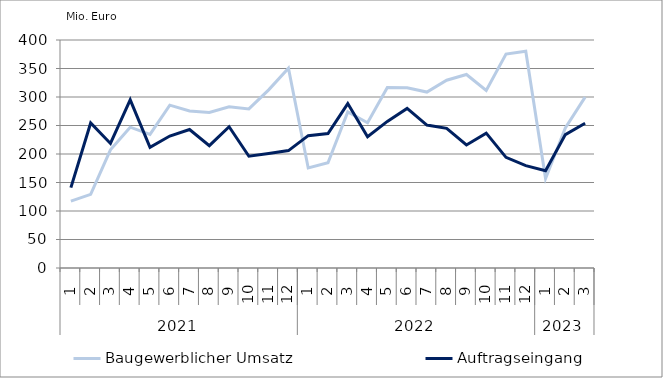
| Category | Baugewerblicher Umsatz | Auftragseingang |
|---|---|---|
| 0 | 117421.805 | 141020.655 |
| 1 | 129162.55 | 254416.876 |
| 2 | 207280.837 | 218451.405 |
| 3 | 247094.279 | 295077.868 |
| 4 | 234515.312 | 211696.129 |
| 5 | 285732.845 | 231455.155 |
| 6 | 275480.885 | 242932.505 |
| 7 | 272787.524 | 214636.944 |
| 8 | 282850.254 | 247827.991 |
| 9 | 279173.21 | 196069.238 |
| 10 | 312511.437 | 201015.897 |
| 11 | 350582.01 | 205949.991 |
| 12 | 175456.852 | 232178.255 |
| 13 | 184578.32 | 236006.862 |
| 14 | 273732.567 | 288451.109 |
| 15 | 254683.671 | 230228.968 |
| 16 | 316794.568 | 257235.39 |
| 17 | 316277.567 | 279900.179 |
| 18 | 308621.034 | 250827.343 |
| 19 | 329490.411 | 244949.341 |
| 20 | 339435.208 | 215809.075 |
| 21 | 311599.811 | 236674.056 |
| 22 | 375203.994 | 194107.214 |
| 23 | 380445.583 | 179631.624 |
| 24 | 156885.157 | 170764.939 |
| 25 | 245647.016 | 234064.391 |
| 26 | 299793.904 | 253873.168 |